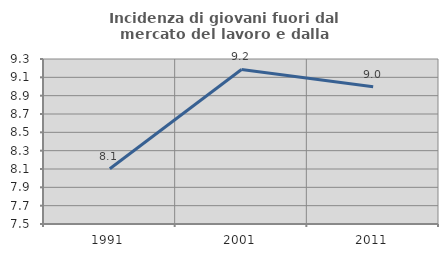
| Category | Incidenza di giovani fuori dal mercato del lavoro e dalla formazione  |
|---|---|
| 1991.0 | 8.103 |
| 2001.0 | 9.186 |
| 2011.0 | 8.997 |